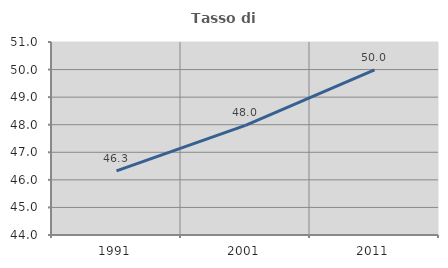
| Category | Tasso di occupazione   |
|---|---|
| 1991.0 | 46.325 |
| 2001.0 | 47.975 |
| 2011.0 | 49.989 |